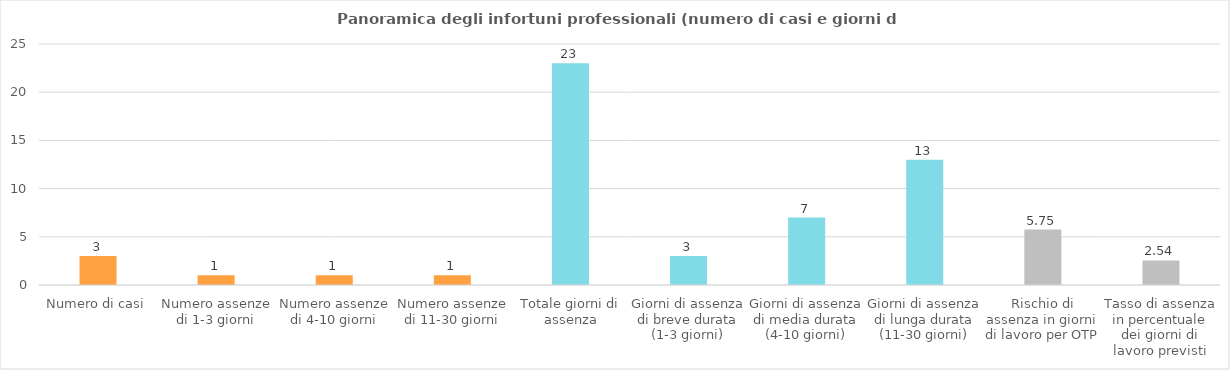
| Category | Infortunio professionale |
|---|---|
| Numero di casi | 3 |
| Numero assenze di 1-3 giorni | 1 |
| Numero assenze di 4-10 giorni | 1 |
| Numero assenze di 11-30 giorni | 1 |
| Totale giorni di assenza | 23 |
| Giorni di assenza di breve durata (1-3 giorni) | 3 |
| Giorni di assenza di media durata (4-10 giorni) | 7 |
| Giorni di assenza di lunga durata (11-30 giorni) | 13 |
| Rischio di assenza in giorni di lavoro per OTP | 5.75 |
| Tasso di assenza in percentuale dei giorni di lavoro previsti | 2.544 |